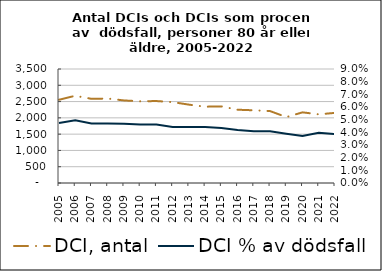
| Category | DCI, antal |
|---|---|
| 2005.0 | 2556 |
| 2006.0 | 2678 |
| 2007.0 | 2584 |
| 2008.0 | 2592 |
| 2009.0 | 2535 |
| 2010.0 | 2508 |
| 2011.0 | 2516 |
| 2012.0 | 2483 |
| 2013.0 | 2406 |
| 2014.0 | 2343 |
| 2015.0 | 2352 |
| 2016.0 | 2250 |
| 2017.0 | 2232 |
| 2018.0 | 2208 |
| 2019.0 | 2024 |
| 2020.0 | 2169 |
| 2021.0 | 2108 |
| 2022.0 | 2153 |